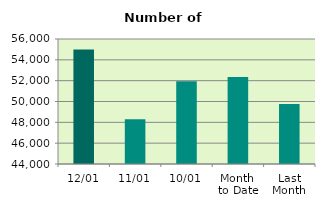
| Category | Series 0 |
|---|---|
| 12/01 | 55000 |
| 11/01 | 48288 |
| 10/01 | 51944 |
| Month 
to Date | 52344.75 |
| Last
Month | 49764 |